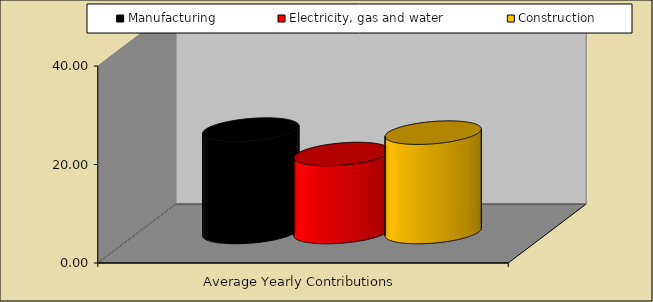
| Category | Manufacturing | Electricity, gas and water | Construction |
|---|---|---|---|
| Average Yearly Contributions | 20.791 | 15.83 | 20.173 |